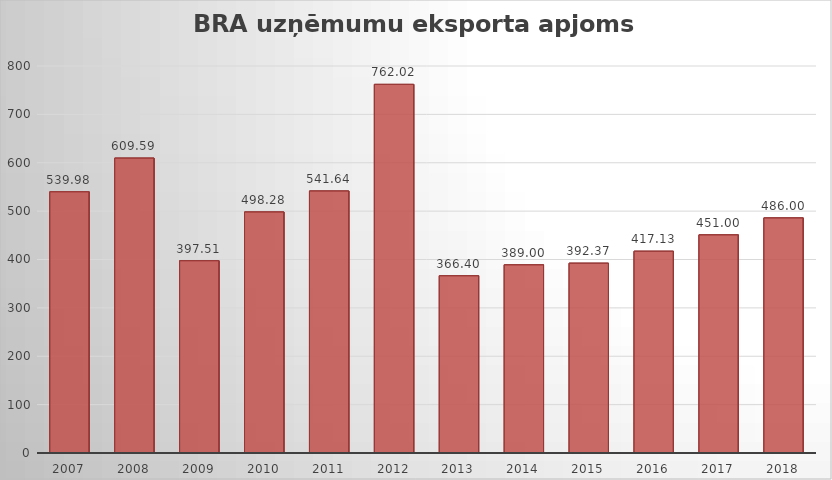
| Category | Series 0 |
|---|---|
| 2007.0 | 539.98 |
| 2008.0 | 609.59 |
| 2009.0 | 397.51 |
| 2010.0 | 498.28 |
| 2011.0 | 541.64 |
| 2012.0 | 762.02 |
| 2013.0 | 366.4 |
| 2014.0 | 389 |
| 2015.0 | 392.37 |
| 2016.0 | 417.13 |
| 2017.0 | 451 |
| 2018.0 | 486 |